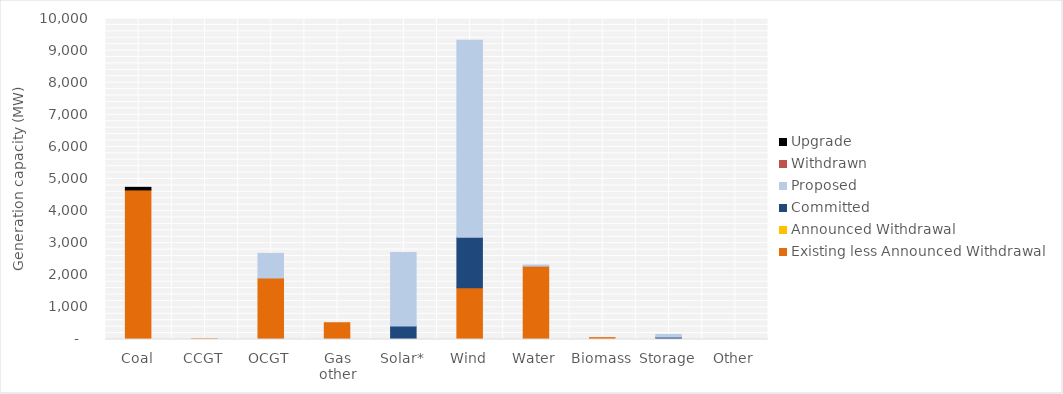
| Category | Existing less Announced Withdrawal | Announced Withdrawal | Committed | Proposed | Withdrawn | Upgrade |
|---|---|---|---|---|---|---|
| Coal | 4660 | 0 | 0 | 0 | 0 | 80 |
| CCGT | 21 | 0 | 0 | 0 | 0 | 0 |
| OCGT | 1916.8 | 0 | 0 | 765 | 0 | 0 |
| Gas other | 522.612 | 0 | 0 | 0 | 0 | 0 |
| Solar* | 21.312 | 0 | 396.75 | 2293.7 | 0 | 0 |
| Wind | 1612.9 | 0 | 1572.65 | 6138 | 0 | 0 |
| Water | 2286.237 | 0 | 0 | 34 | 0 | 0 |
| Biomass | 57.604 | 0 | 0 | 0 | 0 | 0 |
| Storage | 0 | 0 | 75 | 80 | 0 | 0 |
| Other | 0 | 0 | 0 | 0 | 0 | 0 |